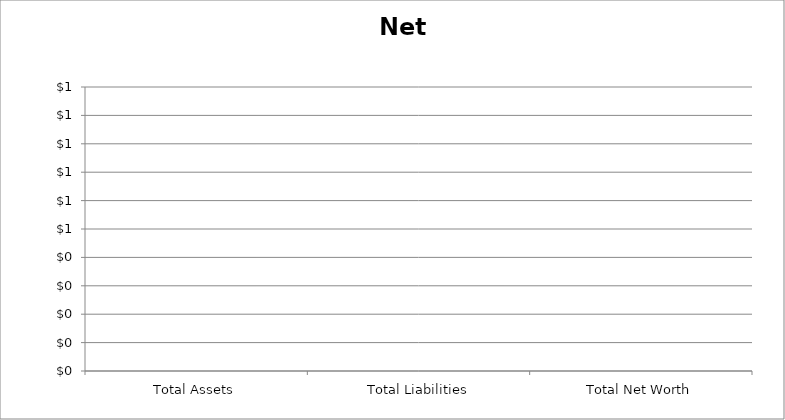
| Category | Series 0 |
|---|---|
| Total Assets | 0 |
| Total Liabilities | 0 |
| Total Net Worth | 0 |